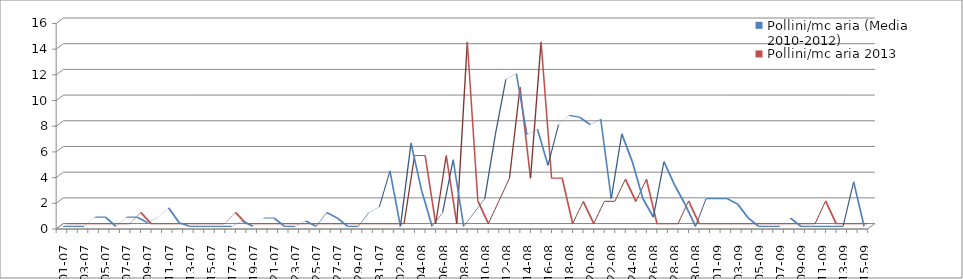
| Category | Pollini/mc aria (Media 2010-2012) | Pollini/mc aria 2013 |
|---|---|---|
| 01-07 | 0 | 0 |
| 02-07 | 0 | 0 |
| 03-07 | 0 | 0 |
| 04-07 | 0.72 | 0 |
| 05-07 | 0.72 | 0 |
| 06-07 | 0 | 0 |
| 07-07 | 0.72 | 0 |
| 08-07 | 0.72 | 0.88 |
| 09-07 | 0.287 | 0 |
| 10-07 | 0.72 | 0 |
| 11-07 | 1.44 | 0 |
| 12-07 | 0.287 | 0 |
| 13-07 | 0 | 0 |
| 14-07 | 0 | 0 |
| 15-07 | 0 | 0 |
| 16-07 | 0 | 0 |
| 17-07 | 0 | 0.88 |
| 18-07 | 0.433 | 0 |
| 19-07 | 0 | 0 |
| 20-07 | 0.65 | 0 |
| 21-07 | 0.65 | 0 |
| 22-07 | 0 | 0 |
| 23-07 | 0 | 0 |
| 24-07 | 0.43 | 0 |
| 25-07 | 0 | 0 |
| 26-07 | 1.08 | 0 |
| 27-07 | 0.65 | 0 |
| 28-07 | 0 | 0 |
| 29-07 | 0 | 0 |
| 30-07 | 1.08 | 0 |
| 31-07 | 1.515 | 0 |
| 01-08 | 4.32 | 0 |
| 02-08 | 0 | 0 |
| 03-08 | 6.48 | 5.3 |
| 04-08 | 2.81 | 5.3 |
| 05-08 | 0 | 0 |
| 06-08 | 1.08 | 5.3 |
| 07-08 | 5.185 | 0 |
| 08-08 | 0 | 14.14 |
| 09-08 | 1.08 | 1.77 |
| 10-08 | 2.16 | 0 |
| 11-08 | 7.13 | 1.77 |
| 12-08 | 11.45 | 3.54 |
| 13-08 | 11.88 | 10.61 |
| 14-08 | 7.13 | 3.54 |
| 15-08 | 7.56 | 14.14 |
| 16-08 | 4.753 | 3.54 |
| 17-08 | 7.92 | 3.54 |
| 18-08 | 8.64 | 0 |
| 19-08 | 8.497 | 1.73 |
| 20-08 | 7.92 | 0 |
| 21-08 | 8.353 | 1.73 |
| 22-08 | 2.16 | 1.73 |
| 23-08 | 7.2 | 3.46 |
| 24-08 | 5.04 | 1.73 |
| 25-08 | 2.16 | 3.46 |
| 26-08 | 0.72 | 0 |
| 27-08 | 5.04 | 0 |
| 28-08 | 3.24 | 0 |
| 29-08 | 1.73 | 1.77 |
| 30-08 | 0 | 0 |
| 31-08 | 2.16 | 0 |
| 01-09 | 2.16 | 0 |
| 02-09 | 2.16 | 0 |
| 03-09 | 1.73 | 0 |
| 04-09 | 0.65 | 0 |
| 05-09 | 0 | 0 |
| 06-09 | 0 | 0 |
| 07-09 | 0 | 0 |
| 08-09 | 0.65 | 0 |
| 09-09 | 0 | 0 |
| 10-09 | 0 | 0 |
| 11-09 | 0 | 1.77 |
| 12-09 | 0 | 0 |
| 13-09 | 0 | 0 |
| 14-09 | 3.46 | 0 |
| 15-09 | 0 | 0 |